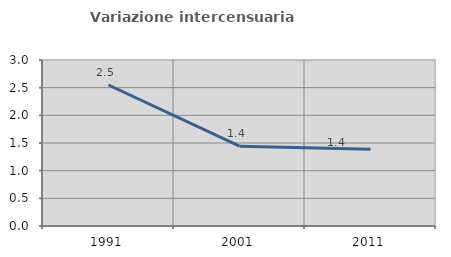
| Category | Variazione intercensuaria annua |
|---|---|
| 1991.0 | 2.548 |
| 2001.0 | 1.443 |
| 2011.0 | 1.386 |